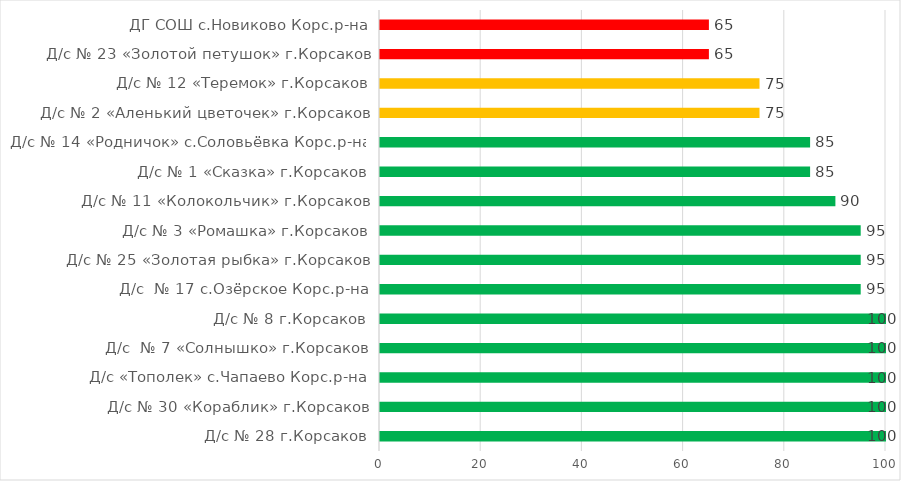
| Category | Series 0 |
|---|---|
| Д/с № 28 г.Корсаков | 100 |
| Д/с № 30 «Кораблик» г.Корсаков | 100 |
| Д/с «Тополек» с.Чапаево Корс.р-на | 100 |
| Д/с  № 7 «Солнышко» г.Корсаков | 100 |
| Д/с № 8 г.Корсаков | 100 |
| Д/с  № 17 с.Озёрское Корс.р-на | 95 |
| Д/с № 25 «Золотая рыбка» г.Корсаков | 95 |
| Д/с № 3 «Ромашка» г.Корсаков | 95 |
| Д/с № 11 «Колокольчик» г.Корсаков | 90 |
| Д/с № 1 «Сказка» г.Корсаков | 85 |
| Д/с № 14 «Родничок» с.Соловьёвка Корс.р-на | 85 |
| Д/с № 2 «Аленький цветочек» г.Корсаков | 75 |
| Д/с № 12 «Теремок» г.Корсаков | 75 |
| Д/с № 23 «Золотой петушок» г.Корсаков | 65 |
|  ДГ СОШ с.Новиково Корс.р-на | 65 |